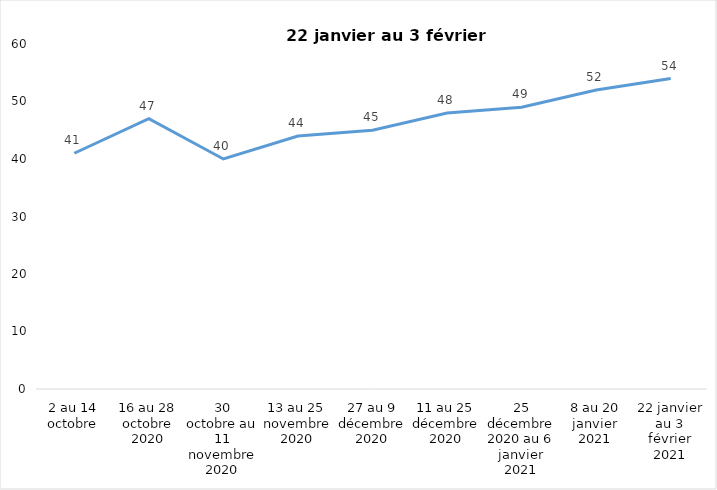
| Category | Toujours aux trois mesures |
|---|---|
| 2 au 14 octobre | 41 |
| 16 au 28 octobre 2020 | 47 |
| 30 octobre au 11 novembre 2020 | 40 |
| 13 au 25 novembre 2020 | 44 |
| 27 au 9 décembre 2020 | 45 |
| 11 au 25 décembre 2020 | 48 |
| 25 décembre 2020 au 6 janvier 2021 | 49 |
| 8 au 20 janvier 2021 | 52 |
| 22 janvier au 3 février 2021 | 54 |